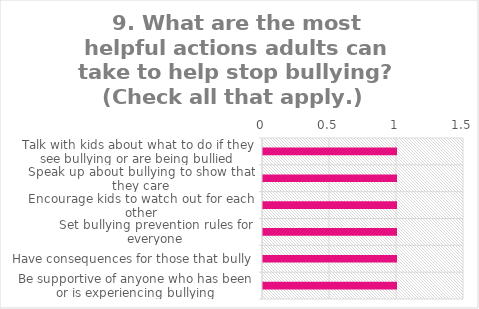
| Category | Field1 |
|---|---|
| Talk with kids about what to do if they see bullying or are being bullied | 1 |
| Speak up about bullying to show that they care | 1 |
| Encourage kids to watch out for each other | 1 |
| Set bullying prevention rules for everyone | 1 |
| Have consequences for those that bully | 1 |
| Be supportive of anyone who has been or is experiencing bullying | 1 |